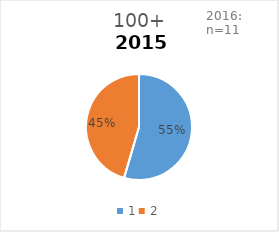
| Category | 100+ |
|---|---|
| 0 | 0.545 |
| 1 | 0.455 |